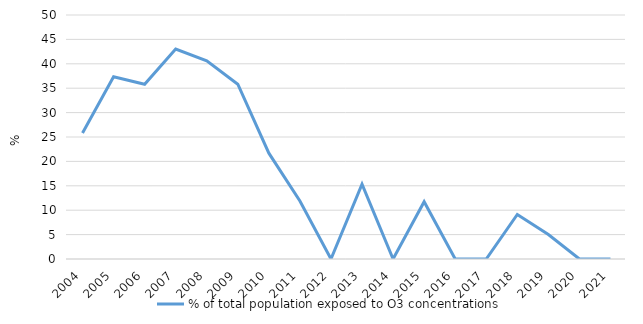
| Category | % of total population exposed to O3 concentrations  |
|---|---|
| 2004.0 | 25.833 |
| 2005.0 | 37.327 |
| 2006.0 | 35.815 |
| 2007.0 | 43.017 |
| 2008.0 | 40.611 |
| 2009.0 | 35.815 |
| 2010.0 | 21.685 |
| 2011.0 | 11.885 |
| 2012.0 | 0 |
| 2013.0 | 15.349 |
| 2014.0 | 0 |
| 2015.0 | 11.744 |
| 2016.0 | 0 |
| 2017.0 | 0 |
| 2018.0 | 9.123 |
| 2019.0 | 5.006 |
| 2020.0 | 0 |
| 2021.0 | 0 |